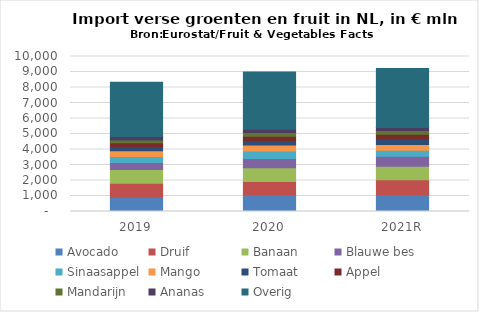
| Category | Avocado | Druif | Banaan | Blauwe bes | Sinaasappel | Mango | Tomaat | Appel | Mandarijn | Ananas | Overig |
|---|---|---|---|---|---|---|---|---|---|---|---|
| 2019 | 920 | 895 | 892 | 449 | 395 | 361 | 280 | 237 | 189 | 224 | 3493 |
| 2020 | 1059 | 869 | 898 | 589 | 488 | 392 | 292 | 273 | 231 | 210 | 3693 |
| 2021R | 1087 | 957 | 880 | 634 | 395 | 371 | 336 | 319 | 243 | 197 | 3813 |